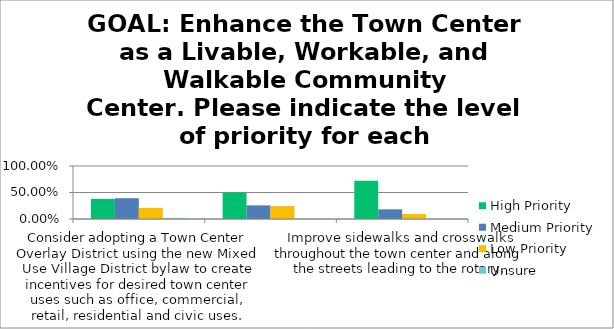
| Category | High Priority | Medium Priority | Low Priority | Unsure |
|---|---|---|---|---|
| Consider adopting a Town Center Overlay District using the new Mixed Use Village District bylaw to create incentives for desired town center uses such as office, commercial, retail, residential and civic uses. | 0.378 | 0.392 | 0.21 | 0.02 |
| Pursue rotary improvements to improve safe access to local businesses. | 0.5 | 0.257 | 0.243 | 0 |
| Improve sidewalks and crosswalks throughout the town center and along the streets leading to the rotary. | 0.723 | 0.182 | 0.095 | 0 |